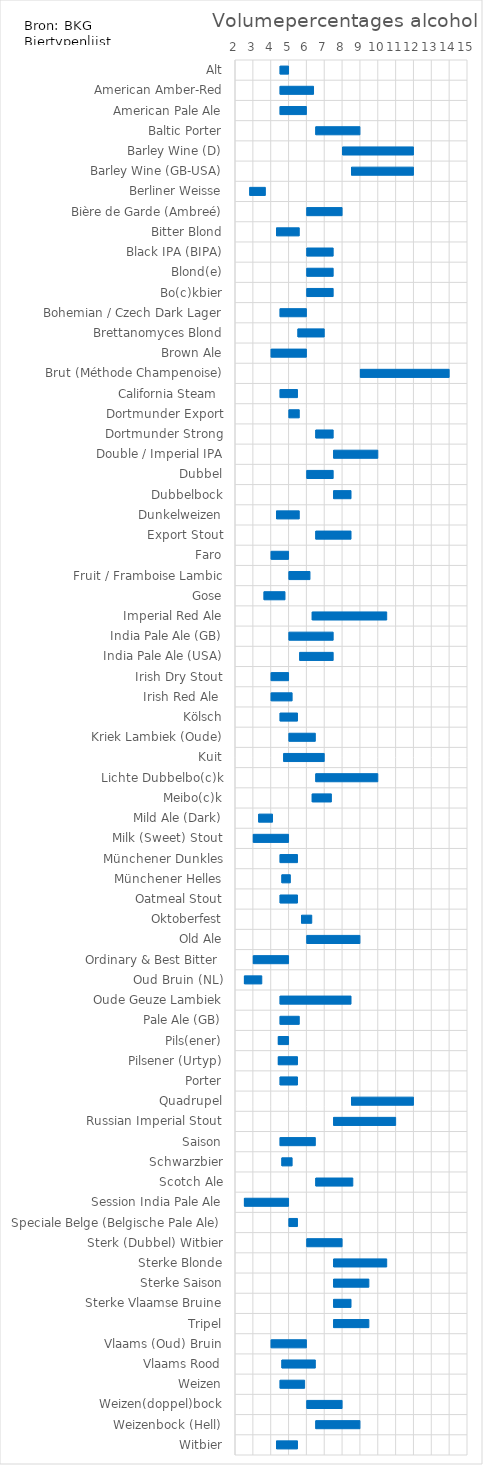
| Category | ABVMIN | ABVDELTA |
|---|---|---|
| Alt | 4.5 | 0.5 |
| American Amber-Red | 4.5 | 1.9 |
| American Pale Ale | 4.5 | 1.5 |
| Baltic Porter | 6.5 | 2.5 |
| Barley Wine (D) | 8 | 4 |
| Barley Wine (GB-USA) | 8.5 | 3.5 |
| Berliner Weisse | 2.8 | 0.9 |
| Bière de Garde (Ambreé) | 6 | 2 |
| Bitter Blond | 4.3 | 1.3 |
| Black IPA (BIPA) | 6 | 1.5 |
| Blond(e) | 6 | 1.5 |
| Bo(c)kbier | 6 | 1.5 |
| Bohemian / Czech Dark Lager | 4.5 | 1.5 |
| Brettanomyces Blond | 5.5 | 1.5 |
| Brown Ale | 4 | 2 |
| Brut (Méthode Champenoise) | 9 | 5 |
| California Steam  | 4.5 | 1 |
| Dortmunder Export | 5 | 0.6 |
| Dortmunder Strong | 6.5 | 1 |
| Double / Imperial IPA | 7.5 | 2.5 |
| Dubbel | 6 | 1.5 |
| Dubbelbock | 7.5 | 1 |
| Dunkelweizen | 4.3 | 1.3 |
| Export Stout | 6.5 | 2 |
| Faro | 4 | 1 |
| Fruit / Framboise Lambic | 5 | 1.2 |
| Gose | 3.6 | 1.2 |
| Imperial Red Ale | 6.3 | 4.2 |
| India Pale Ale (GB) | 5 | 2.5 |
| India Pale Ale (USA) | 5.6 | 1.9 |
| Irish Dry Stout | 4 | 1 |
| Irish Red Ale  | 4 | 1.2 |
| Kölsch | 4.5 | 1 |
| Kriek Lambiek (Oude) | 5 | 1.5 |
| Kuit | 4.7 | 2.3 |
| Lichte Dubbelbo(c)k | 6.5 | 3.5 |
| Meibo(c)k | 6.3 | 1.1 |
| Mild Ale (Dark) | 3.3 | 0.8 |
| Milk (Sweet) Stout | 3 | 2 |
| Münchener Dunkles | 4.5 | 1 |
| Münchener Helles | 4.6 | 0.5 |
| Oatmeal Stout | 4.5 | 1 |
| Oktoberfest | 5.7 | 0.6 |
| Old Ale | 6 | 3 |
| Ordinary & Best Bitter  | 3 | 2 |
| Oud Bruin (NL) | 2.5 | 1 |
| Oude Geuze Lambiek | 4.5 | 4 |
| Pale Ale (GB) | 4.5 | 1.1 |
| Pils(ener) | 4.4 | 0.6 |
| Pilsener (Urtyp) | 4.4 | 1.1 |
| Porter | 4.5 | 1 |
| Quadrupel | 8.5 | 3.5 |
| Russian Imperial Stout | 7.5 | 3.5 |
| Saison | 4.5 | 2 |
| Schwarzbier | 4.6 | 0.6 |
| Scotch Ale | 6.5 | 2.1 |
| Session India Pale Ale | 2.5 | 2.5 |
| Speciale Belge (Belgische Pale Ale) | 5 | 0.5 |
| Sterk (Dubbel) Witbier | 6 | 2 |
| Sterke Blonde | 7.5 | 3 |
| Sterke Saison | 7.5 | 2 |
| Sterke Vlaamse Bruine | 7.5 | 1 |
| Tripel | 7.5 | 2 |
| Vlaams (Oud) Bruin | 4 | 2 |
| Vlaams Rood | 4.6 | 1.9 |
| Weizen | 4.5 | 1.4 |
| Weizen(doppel)bock | 6 | 2 |
| Weizenbock (Hell) | 6.5 | 2.5 |
| Witbier | 4.3 | 1.2 |